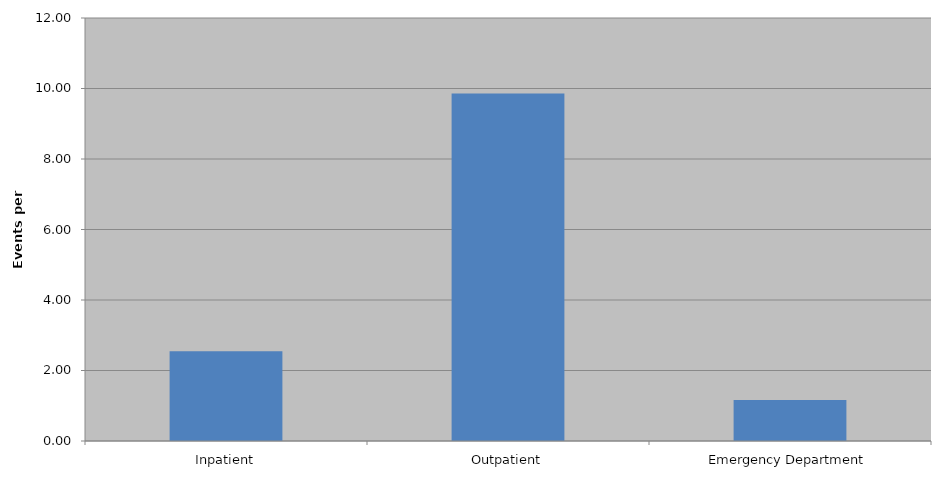
| Category | Total |
|---|---|
| Inpatient | 2.545 |
| Outpatient | 9.861 |
| Emergency Department | 1.167 |